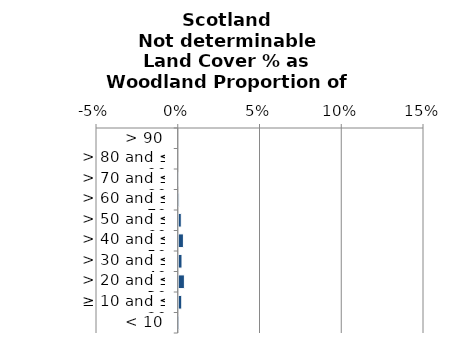
| Category | Not determinable |
|---|---|
|  < 10 | 0 |
|  ≥ 10 and ≤ 20 | 0.002 |
|  > 20 and ≤ 30 | 0.003 |
|  > 30 and ≤ 40 | 0.002 |
|  > 40 and ≤ 50 | 0.003 |
|  > 50 and ≤ 60 | 0.002 |
|  > 60 and ≤ 70 | 0 |
|  > 70 and ≤ 80 | 0 |
|  > 80 and ≤ 90 | 0 |
|  > 90 | 0 |